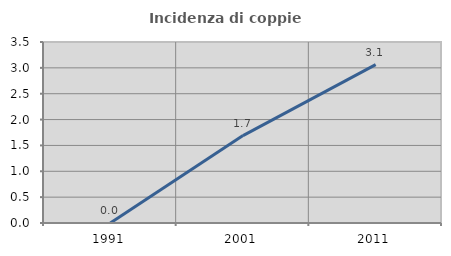
| Category | Incidenza di coppie miste |
|---|---|
| 1991.0 | 0 |
| 2001.0 | 1.691 |
| 2011.0 | 3.061 |